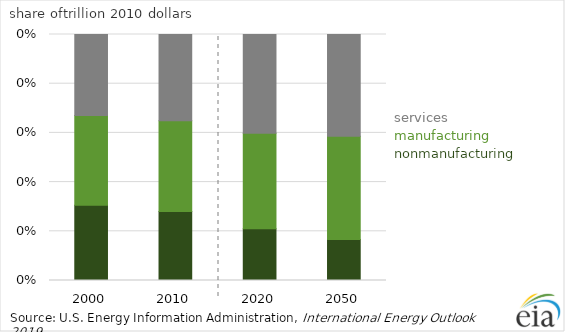
| Category | Nonmanufacturing | Manufacturing | Services |
|---|---|---|---|
| 2000.0 | 0.306 | 0.364 | 0.329 |
| 2010.0 | 0.28 | 0.369 | 0.35 |
| 2020.0 | 0.21 | 0.389 | 0.401 |
| 2050.0 | 0.167 | 0.42 | 0.413 |